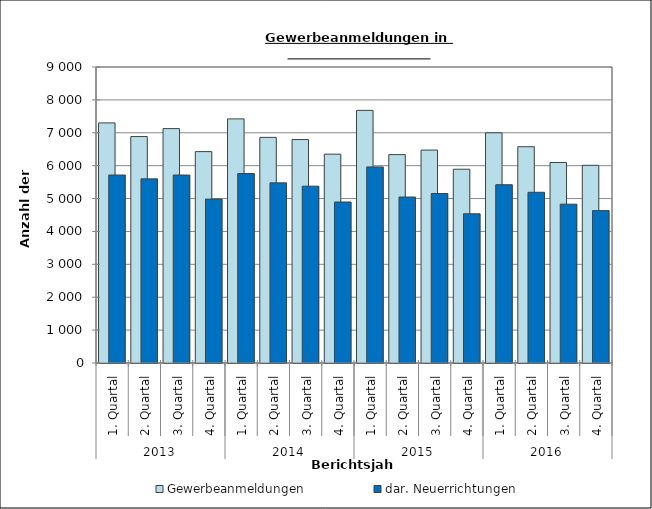
| Category | Gewerbeanmeldungen | dar. Neuerrichtungen |
|---|---|---|
| 0 | 7300 | 5715 |
| 1 | 6885 | 5599 |
| 2 | 7127 | 5715 |
| 3 | 6427 | 4984 |
| 4 | 7422 | 5760 |
| 5 | 6860 | 5477 |
| 6 | 6794 | 5377 |
| 7 | 6350 | 4895 |
| 8 | 7681 | 5962 |
| 9 | 6336 | 5046 |
| 10 | 6474 | 5153 |
| 11 | 5892 | 4537 |
| 12 | 7000 | 5421 |
| 13 | 6576 | 5191 |
| 14 | 6097 | 4829 |
| 15 | 6010 | 4634 |